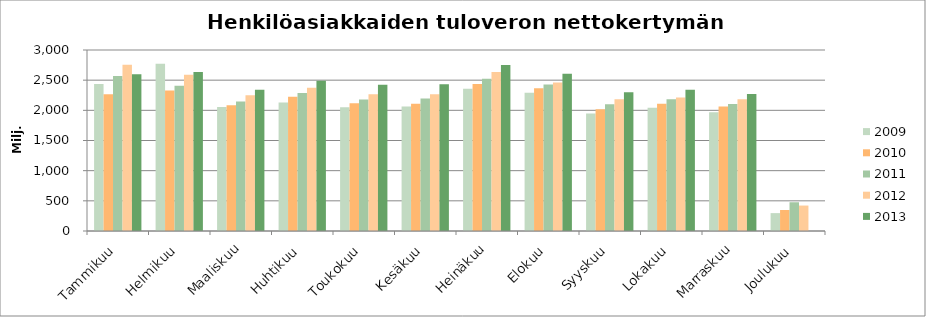
| Category | 2009 | 2010 | 2011 | 2012 | 2013 |
|---|---|---|---|---|---|
| Tammikuu | 2438.489 | 2267.873 | 2569.442 | 2754.468 | 2597.268 |
| Helmikuu | 2771.607 | 2330.409 | 2406.04 | 2591.616 | 2636.607 |
| Maaliskuu | 2054.852 | 2084.249 | 2145.291 | 2250.057 | 2340.316 |
| Huhtikuu | 2131.066 | 2225.487 | 2285.914 | 2375.631 | 2492.368 |
| Toukokuu | 2051.558 | 2117.095 | 2177.688 | 2264.689 | 2423.516 |
| Kesäkuu | 2063.182 | 2109.339 | 2194.481 | 2268.001 | 2432.777 |
| Heinäkuu | 2357.008 | 2435.026 | 2524.383 | 2633.57 | 2750.145 |
| Elokuu | 2289.863 | 2364.596 | 2427.052 | 2461.949 | 2607.529 |
| Syyskuu | 1946.167 | 2019.118 | 2102.001 | 2184.152 | 2299.363 |
| Lokakuu | 2041.676 | 2107.95 | 2185.045 | 2211.144 | 2342.648 |
| Marraskuu | 1967.798 | 2063.457 | 2106.752 | 2183.43 | 2270.307 |
| Joulukuu | 296.354 | 347.927 | 476.484 | 421.857 | 0 |